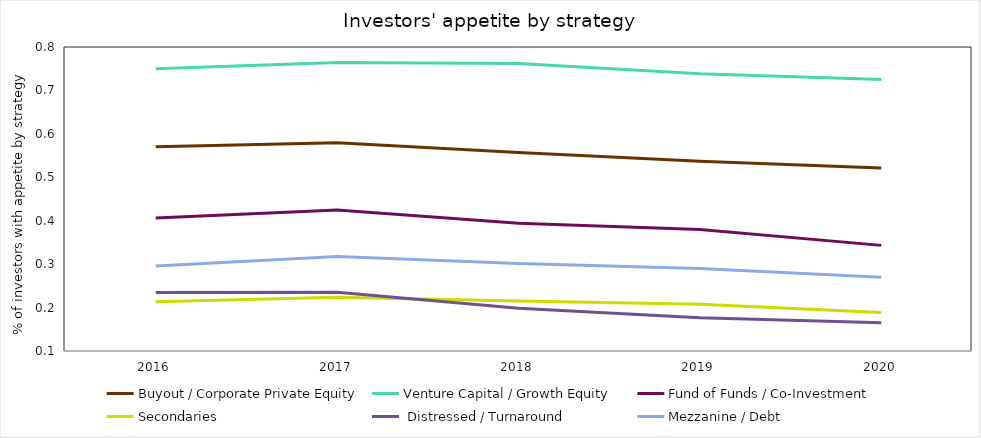
| Category | Buyout / Corporate Private Equity | Venture Capital / Growth Equity | Fund of Funds / Co-Investment | Secondaries |  Distressed / Turnaround | Mezzanine / Debt |
|---|---|---|---|---|---|---|
| 2016.0 | 0.57 | 0.75 | 0.406 | 0.213 | 0.235 | 0.296 |
| 2017.0 | 0.579 | 0.765 | 0.425 | 0.224 | 0.235 | 0.318 |
| 2018.0 | 0.557 | 0.762 | 0.394 | 0.215 | 0.199 | 0.302 |
| 2019.0 | 0.537 | 0.738 | 0.38 | 0.208 | 0.176 | 0.29 |
| 2020.0 | 0.521 | 0.725 | 0.343 | 0.189 | 0.165 | 0.27 |